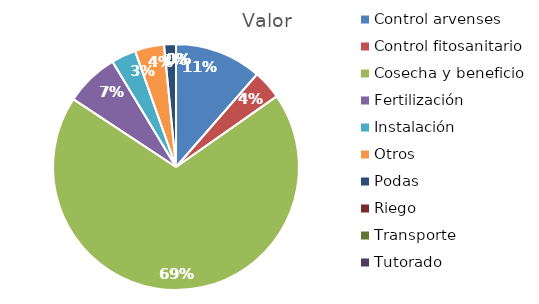
| Category | Valor |
|---|---|
| Control arvenses | 12041792 |
| Control fitosanitario | 4044352 |
| Cosecha y beneficio | 72734567 |
| Fertilización | 7456774 |
| Instalación | 3412422 |
| Otros | 4044352 |
| Podas | 1643018 |
| Riego | 0 |
| Transporte | 0 |
| Tutorado | 0 |